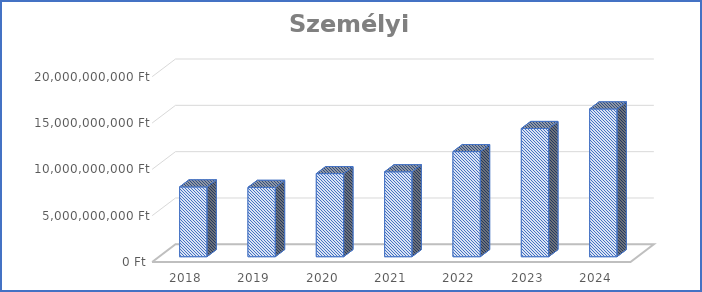
| Category | Személyi juttatások |
|---|---|
| 2018.0 | 7532985548 |
| 2019.0 | 7484578131 |
| 2020.0 | 8967604485 |
| 2021.0 | 9163782444 |
| 2022.0 | 11342642101 |
| 2023.0 | 13836537368 |
| 2024.0 | 15947314168 |